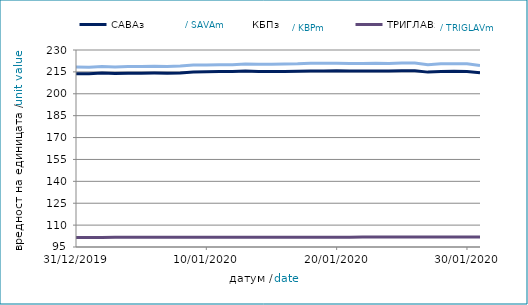
| Category | САВАз | КБПз | ТРИГЛАВз |
|---|---|---|---|
| 31/12/2019 | 213.758 | 218.317 | 101.578 |
| 01/01/2020 | 213.649 | 218.122 | 101.588 |
| 02/01/2020 | 214.155 | 218.715 | 101.596 |
| 03/01/2020 | 213.913 | 218.408 | 101.604 |
| 04/01/2020 | 214.082 | 218.66 | 101.612 |
| 05/01/2020 | 214.094 | 218.673 | 101.619 |
| 06/01/2020 | 214.176 | 218.819 | 101.625 |
| 07/01/2020 | 214.145 | 218.717 | 101.632 |
| 08/01/2020 | 214.315 | 219.023 | 101.642 |
| 09/01/2020 | 214.899 | 219.653 | 101.658 |
| 10/01/2020 | 215.103 | 219.722 | 101.682 |
| 11/01/2020 | 215.194 | 219.854 | 101.691 |
| 12/01/2020 | 215.207 | 219.867 | 101.698 |
| 13/01/2020 | 215.526 | 220.425 | 101.718 |
| 14/01/2020 | 215.327 | 220.157 | 101.716 |
| 15/01/2020 | 215.222 | 220.207 | 101.72 |
| 16/01/2020 | 215.213 | 220.464 | 101.718 |
| 17/01/2020 | 215.389 | 220.54 | 101.723 |
| 18/01/2020 | 215.618 | 220.89 | 101.731 |
| 19/01/2020 | 215.63 | 220.902 | 101.737 |
| 20/01/2020 | 215.745 | 220.995 | 101.752 |
| 21/01/2020 | 215.635 | 220.771 | 101.758 |
| 22/01/2020 | 215.617 | 220.795 | 101.774 |
| 23/01/2020 | 215.591 | 220.95 | 101.789 |
| 24/01/2020 | 215.556 | 220.692 | 101.81 |
| 25/01/2020 | 215.818 | 221.064 | 101.823 |
| 26/01/2020 | 215.831 | 221.076 | 101.83 |
| 27/01/2020 | 214.844 | 219.869 | 101.837 |
| 28/01/2020 | 215.327 | 220.536 | 101.843 |
| 29/01/2020 | 215.432 | 220.636 | 101.853 |
| 30/01/2020 | 215.197 | 220.612 | 101.863 |
| 31/01/2020 | 214.42 | 219.379 | 101.874 |